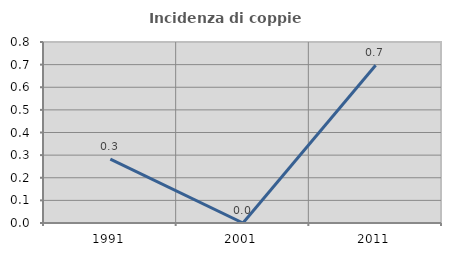
| Category | Incidenza di coppie miste |
|---|---|
| 1991.0 | 0.282 |
| 2001.0 | 0 |
| 2011.0 | 0.697 |